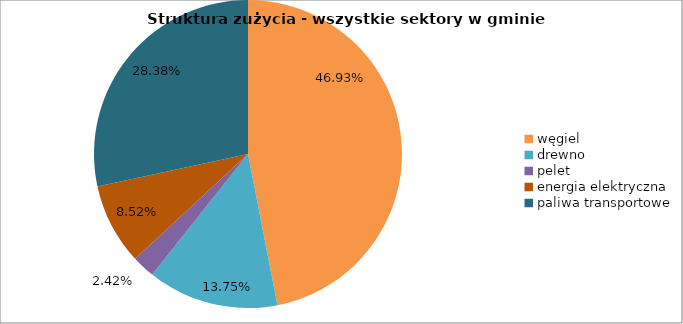
| Category | Series 0 |
|---|---|
| węgiel | 66499.659 |
| drewno | 19485.306 |
| pelet | 3420 |
| energia elektryczna | 12076.515 |
| paliwa transportowe | 40213.85 |